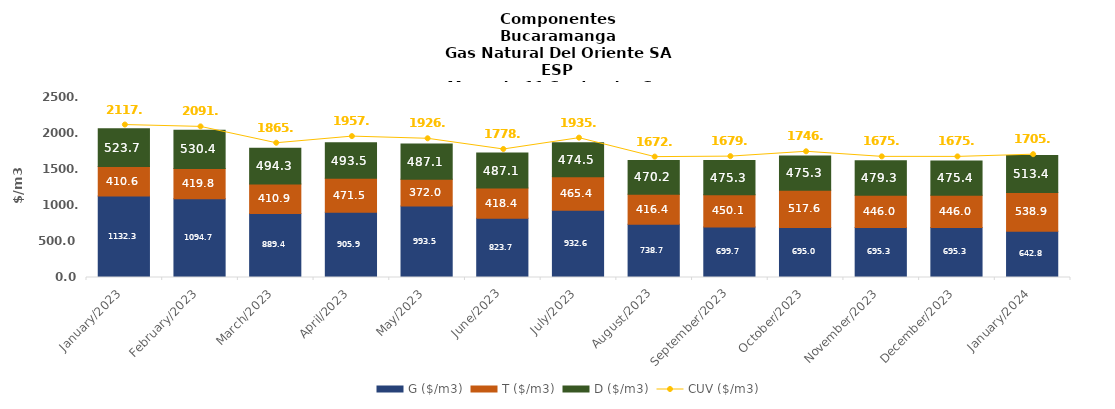
| Category | G ($/m3) | T ($/m3) | D ($/m3) |
|---|---|---|---|
| 2023-01-01 | 1132.3 | 410.55 | 523.74 |
| 2023-02-01 | 1094.71 | 419.79 | 530.39 |
| 2023-03-01 | 889.39 | 410.92 | 494.25 |
| 2023-04-01 | 905.91 | 471.46 | 493.54 |
| 2023-05-01 | 993.53 | 372.04 | 487.06 |
| 2023-06-01 | 823.66 | 418.43 | 487.06 |
| 2023-07-01 | 932.63 | 465.37 | 474.47 |
| 2023-08-01 | 738.7 | 416.42 | 470.2 |
| 2023-09-01 | 699.68 | 450.11 | 475.33 |
| 2023-10-01 | 694.96 | 517.63 | 475.33 |
| 2023-11-01 | 695.28 | 446.03 | 479.27 |
| 2023-12-01 | 695.28 | 446.03 | 475.44 |
| 2024-01-01 | 642.83 | 538.87 | 513.39 |